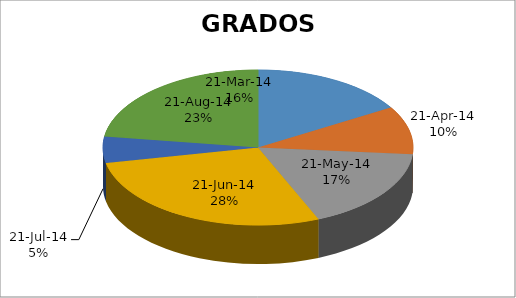
| Category | Series 0 |
|---|---|
| 41719.0 | 18 |
| 41782.0 | 11 |
| 41845.0 | 19 |
| 41915.0 | 31 |
| 41950.0 | 6 |
| 41985.0 | 25 |